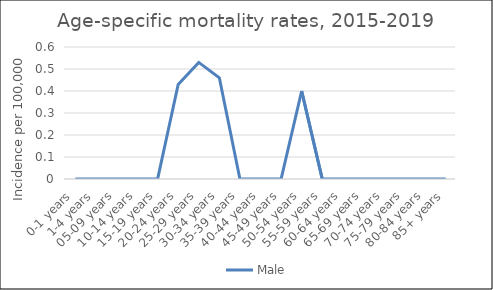
| Category | Male |
|---|---|
| 0-1 years | 0 |
| 1-4 years | 0 |
| 05-09 years | 0 |
| 10-14 years | 0 |
| 15-19 years | 0 |
| 20-24 years | 0.43 |
| 25-29 years | 0.53 |
| 30-34 years | 0.46 |
| 35-39 years | 0 |
| 40-44 years | 0 |
| 45-49 years | 0 |
| 50-54 years | 0.4 |
| 55-59 years | 0 |
| 60-64 years | 0 |
| 65-69 years | 0 |
| 70-74 years | 0 |
| 75-79 years | 0 |
| 80-84 years | 0 |
| 85+ years | 0 |